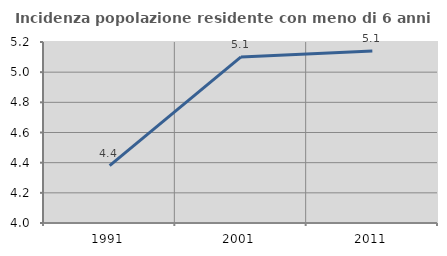
| Category | Incidenza popolazione residente con meno di 6 anni |
|---|---|
| 1991.0 | 4.38 |
| 2001.0 | 5.101 |
| 2011.0 | 5.14 |